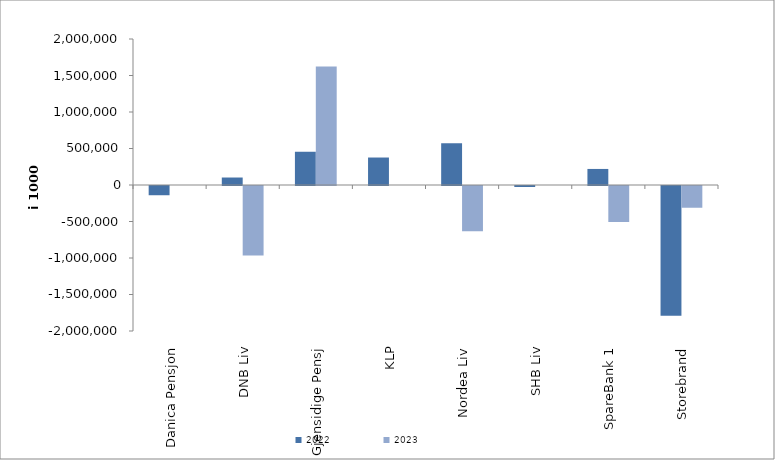
| Category | 2022 | 2023 |
|---|---|---|
| Danica Pensjon | -126546.379 | 0 |
| DNB Liv | 102521.869 | -951646 |
| Gjensidige Pensj | 455446 | 1621849 |
| KLP | 376440.529 | 0 |
| Nordea Liv | 571331.033 | -618652.86 |
| SHB Liv | -13926.68 | 0 |
| SpareBank 1 | 219966.442 | -493333.321 |
| Storebrand | -1778807.634 | -297882.168 |